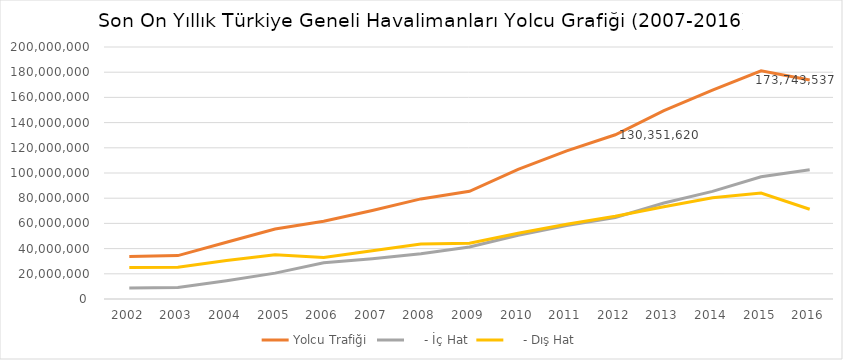
| Category | Yolcu Trafiği |     - İç Hat |     - Dış Hat |
|---|---|---|---|
| 2002.0 | 33783892 | 8729279 | 25054613 |
| 2003.0 | 34443655 | 9147439 | 25296216 |
| 2004.0 | 45057371 | 14460864 | 30596507 |
| 2005.0 | 55572426 | 20529469 | 35042957 |
| 2006.0 | 61655659 | 28774857 | 32880802 |
| 2007.0 | 70296532 | 31949341 | 38347191 |
| 2008.0 | 79438289 | 35832776 | 43605513 |
| 2009.0 | 85508508 | 41226959 | 44281549 |
| 2010.0 | 102800392 | 50575426 | 52224966 |
| 2011.0 | 117620469 | 58258324 | 59362145 |
| 2012.0 | 130351620 | 64721316 | 65630304 |
| 2013.0 | 149430421 | 76148526 | 73281895 |
| 2014.0 | 165720234 | 85416166 | 80304068 |
| 2015.0 | 181074531 | 97041210 | 84033321 |
| 2016.0 | 173743537 | 102499358 | 71244179 |